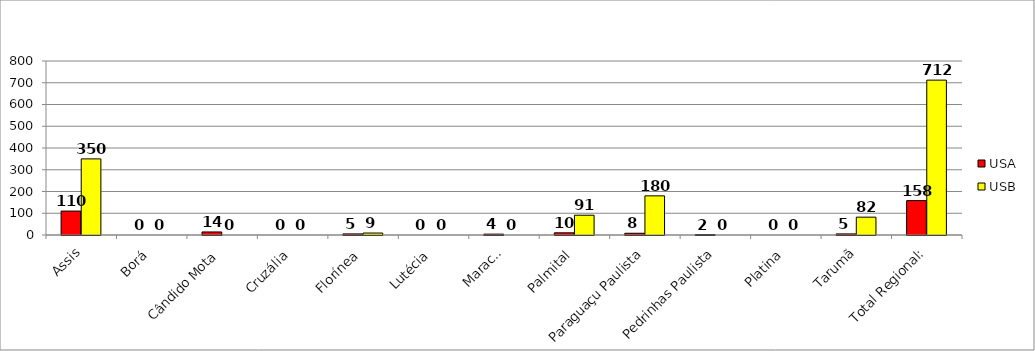
| Category | USA | USB |
|---|---|---|
| Assis | 110 | 350 |
| Borá | 0 | 0 |
| Cândido Mota | 14 | 0 |
| Cruzália | 0 | 0 |
| Florínea | 5 | 9 |
| Lutécia | 0 | 0 |
| Maracaí | 4 | 0 |
| Palmital | 10 | 91 |
| Paraguaçu Paulista | 8 | 180 |
| Pedrinhas Paulista | 2 | 0 |
| Platina | 0 | 0 |
| Tarumã | 5 | 82 |
| Total Regional: | 158 | 712 |